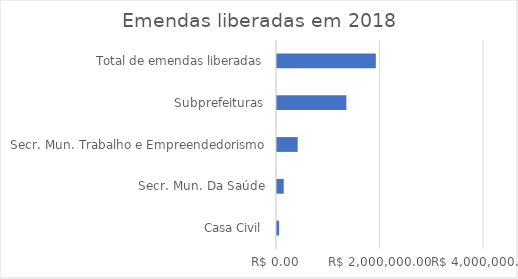
| Category | Valor |
|---|---|
| Casa Civil | 40000 |
| Secr. Mun. Da Saúde | 130000 |
| Secr. Mun. Trabalho e Empreendedorismo | 400000 |
| Subprefeituras | 1340000 |
| Total de emendas liberadas | 1910000 |